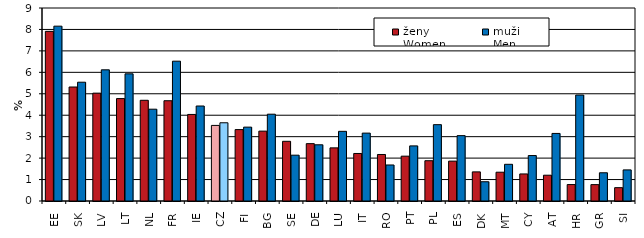
| Category | ženy
Women | muži
Men |
|---|---|---|
| EE | 7.911 | 8.153 |
| SK | 5.316 | 5.539 |
| LV | 5.03 | 6.117 |
| LT | 4.775 | 5.931 |
| NL | 4.696 | 4.281 |
| FR | 4.676 | 6.52 |
| IE | 4.036 | 4.429 |
| CZ | 3.525 | 3.648 |
| FI | 3.33 | 3.444 |
| BG | 3.258 | 4.048 |
| SE | 2.784 | 2.137 |
| DE | 2.675 | 2.621 |
| LU | 2.477 | 3.249 |
| IT | 2.216 | 3.165 |
| RO | 2.169 | 1.68 |
| PT | 2.091 | 2.57 |
| PL | 1.879 | 3.56 |
| ES | 1.859 | 3.048 |
| DK | 1.358 | 0.898 |
| MT | 1.342 | 1.711 |
| CY | 1.262 | 2.119 |
| AT | 1.203 | 3.151 |
| HR | 0.767 | 4.941 |
| GR | 0.764 | 1.316 |
| SI | 0.622 | 1.45 |